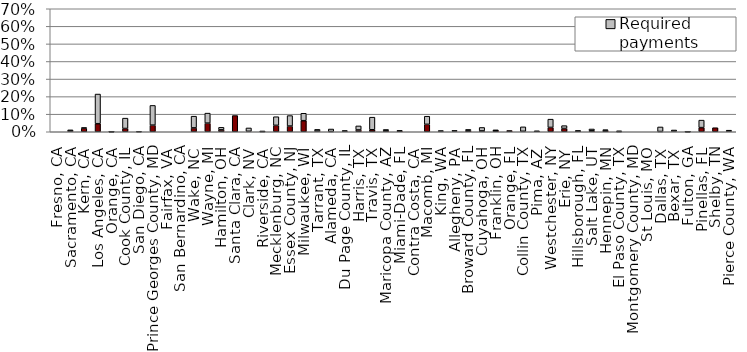
| Category | Current payments | Required payments |
|---|---|---|
| Fresno, CA | 0 | 0 |
| Sacramento, CA | 0.004 | 0.007 |
| Kern, CA | 0.021 | 0.002 |
| Los Angeles, CA | 0.046 | 0.169 |
| Orange, CA | 0 | 0 |
| Cook County, IL | 0.019 | 0.059 |
| San Diego, CA | 0 | 0 |
| Prince Georges County, MD | 0.038 | 0.112 |
| Fairfax, VA | 0 | 0 |
| San Bernardino, CA | 0 | 0 |
| Wake, NC | 0.022 | 0.067 |
| Wayne, MI | 0.049 | 0.057 |
| Hamilton, OH | 0.011 | 0.015 |
| Santa Clara, CA | 0.092 | 0 |
| Clark, NV | 0.002 | 0.019 |
| Riverside, CA | 0.002 | 0 |
| Mecklenburg, NC | 0.036 | 0.049 |
| Essex County, NJ | 0.032 | 0.06 |
| Milwaukee, WI | 0.063 | 0.042 |
| Tarrant, TX | 0.004 | 0.009 |
| Alameda, CA | 0.001 | 0.014 |
| Du Page County, IL | 0.003 | 0.002 |
| Harris, TX | 0.01 | 0.023 |
| Travis, TX | 0.011 | 0.072 |
| Maricopa County, AZ | 0.005 | 0.008 |
| Miami-Dade, FL | 0.005 | 0 |
| Contra Costa, CA | 0 | 0 |
| Macomb, MI | 0.042 | 0.046 |
| King, WA | 0.002 | 0.004 |
| Allegheny, PA | 0.003 | 0.005 |
| Broward County, FL | 0.006 | 0.007 |
| Cuyahoga, OH | 0.005 | 0.02 |
| Franklin, OH | 0.008 | 0 |
| Orange, FL | 0.007 | 0 |
| Collin County, TX | 0.003 | 0.025 |
| Pima, AZ | 0.003 | 0 |
| Westchester, NY | 0.025 | 0.047 |
| Erie, NY | 0.019 | 0.016 |
| Hillsborough, FL | 0.004 | 0.001 |
| Salt Lake, UT | 0.005 | 0.01 |
| Hennepin, MN | 0.007 | 0.005 |
| El Paso County, TX | 0.001 | 0.004 |
| Montgomery County, MD | 0 | 0 |
| St Louis, MO | 0 | 0 |
| Dallas, TX | 0.001 | 0.026 |
| Bexar, TX | 0.003 | 0.007 |
| Fulton, GA | 0 | 0 |
| Pinellas, FL | 0.024 | 0.043 |
| Shelby, TN | 0.023 | 0 |
| Pierce County, WA | 0.004 | 0.005 |